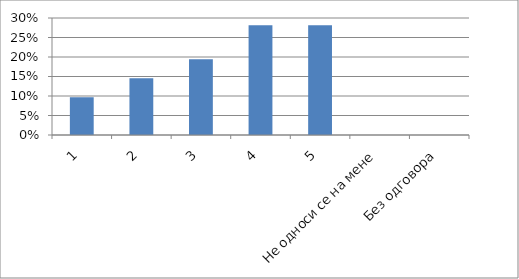
| Category | Series 0 |
|---|---|
| 1 | 0.097 |
| 2 | 0.146 |
| 3 | 0.194 |
| 4 | 0.282 |
| 5 | 0.282 |
| Не односи се на мене | 0 |
| Без одговора | 0 |